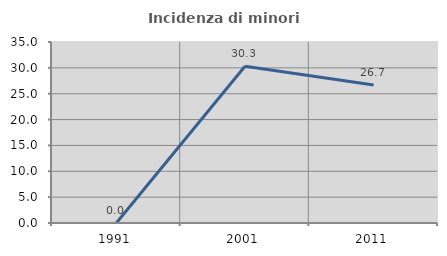
| Category | Incidenza di minori stranieri |
|---|---|
| 1991.0 | 0 |
| 2001.0 | 30.303 |
| 2011.0 | 26.686 |